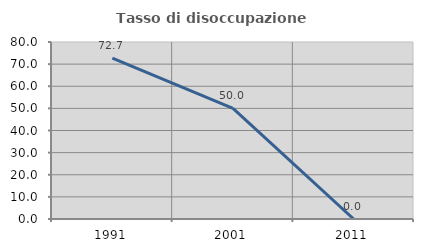
| Category | Tasso di disoccupazione giovanile  |
|---|---|
| 1991.0 | 72.727 |
| 2001.0 | 50 |
| 2011.0 | 0 |